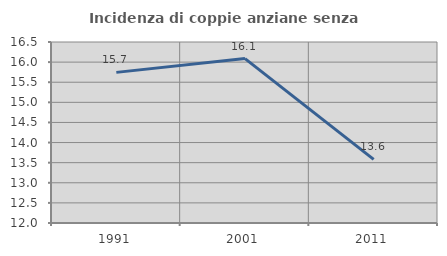
| Category | Incidenza di coppie anziane senza figli  |
|---|---|
| 1991.0 | 15.745 |
| 2001.0 | 16.087 |
| 2011.0 | 13.58 |